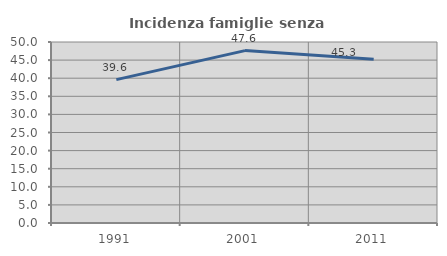
| Category | Incidenza famiglie senza nuclei |
|---|---|
| 1991.0 | 39.604 |
| 2001.0 | 47.619 |
| 2011.0 | 45.263 |